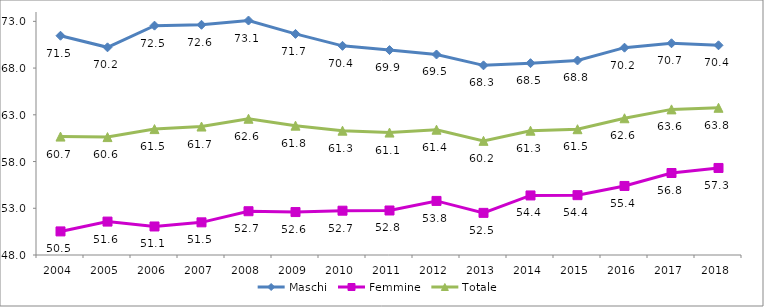
| Category | Maschi | Femmine | Totale  |
|---|---|---|---|
| 2004.0 | 71.46 | 50.524 | 60.669 |
| 2005.0 | 70.221 | 51.575 | 60.617 |
| 2006.0 | 72.539 | 51.051 | 61.471 |
| 2007.0 | 72.633 | 51.494 | 61.745 |
| 2008.0 | 73.087 | 52.684 | 62.578 |
| 2009.0 | 71.655 | 52.595 | 61.841 |
| 2010.0 | 70.379 | 52.74 | 61.302 |
| 2011.0 | 69.927 | 52.763 | 61.099 |
| 2012.0 | 69.453 | 53.787 | 61.408 |
| 2013.0 | 68.292 | 52.508 | 60.214 |
| 2014.0 | 68.523 | 54.371 | 61.301 |
| 2015.0 | 68.812 | 54.403 | 61.459 |
| 2016.0 | 70.183 | 55.389 | 62.63 |
| 2017.0 | 70.655 | 56.773 | 63.58 |
| 2018.0 | 70.436 | 57.312 | 63.752 |